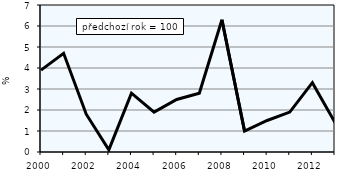
| Category | Series 0 |
|---|---|
| 2000.0 | 3.9 |
| 2001.0 | 4.7 |
| 2002.0 | 1.8 |
| 2003.0 | 0.1 |
| 2004.0 | 2.8 |
| 2005.0 | 1.9 |
| 2006.0 | 2.5 |
| 2007.0 | 2.8 |
| 2008.0 | 6.3 |
| 2009.0 | 1 |
| 2010.0 | 1.5 |
| 2011.0 | 1.9 |
| 2012.0 | 3.3 |
| 2013.0 | 1.4 |